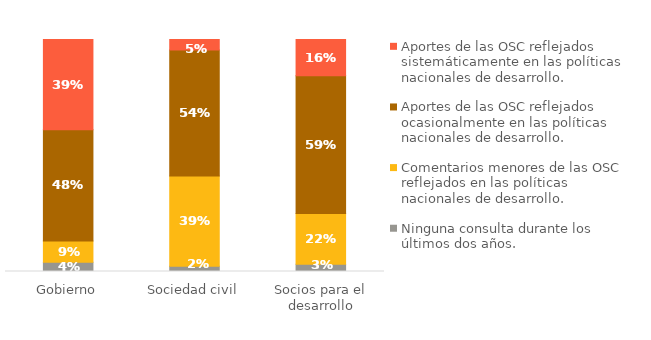
| Category | Ninguna consulta durante los últimos dos años. | Comentarios menores de las OSC reflejados en las políticas nacionales de desarrollo. | Aportes de las OSC reflejados ocasionalmente en las políticas nacionales de desarrollo. | Aportes de las OSC reflejados sistemáticamente en las políticas nacionales de desarrollo. |
|---|---|---|---|---|
| Gobierno | 0.04 | 0.091 | 0.477 | 0.386 |
| Sociedad civil | 0.023 | 0.386 | 0.54 | 0.045 |
| Socios para el desarrollo | 0.031 | 0.219 | 0.594 | 0.156 |